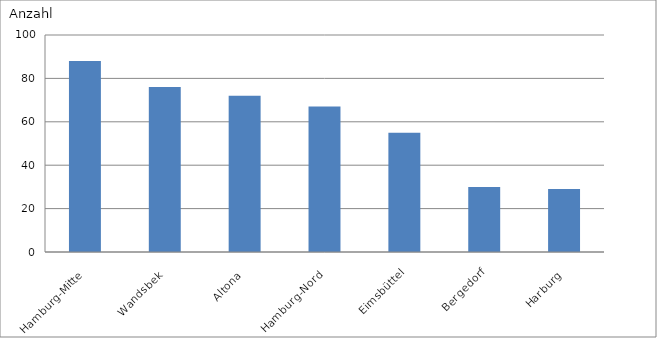
| Category | Hamburg-Mitte |
|---|---|
| Hamburg-Mitte | 88 |
| Wandsbek | 76 |
| Altona | 72 |
| Hamburg-Nord | 67 |
| Eimsbüttel | 55 |
| Bergedorf | 30 |
| Harburg | 29 |